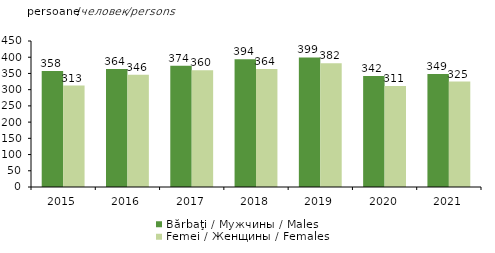
| Category | Bărbaţi / Мужчины / Males   | Femei / Женщины / Females  |
|---|---|---|
| 2015.0 | 357.9 | 312.7 |
| 2016.0 | 363.6 | 345.8 |
| 2017.0 | 374.1 | 360.2 |
| 2018.0 | 393.7 | 363.5 |
| 2019.0 | 399.4 | 381.5 |
| 2020.0 | 342.4 | 311.4 |
| 2021.0 | 348.6 | 324.8 |